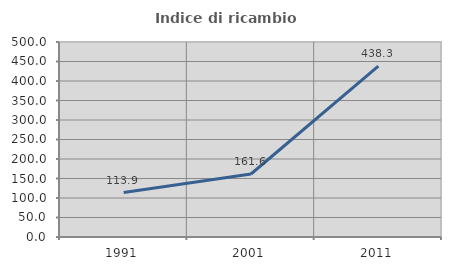
| Category | Indice di ricambio occupazionale  |
|---|---|
| 1991.0 | 113.87 |
| 2001.0 | 161.567 |
| 2011.0 | 438.313 |